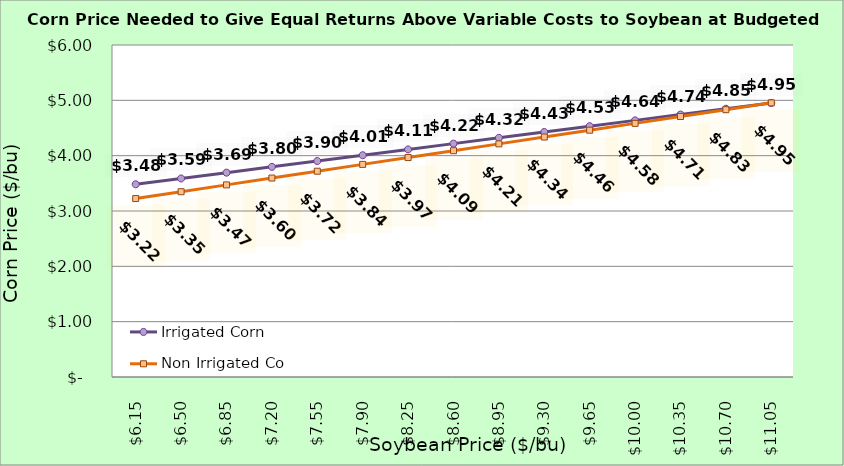
| Category | Irrigated Corn | Non Irrigated Corn |
|---|---|---|
| 6.150000000000002 | 3.483 | 3.225 |
| 6.500000000000002 | 3.588 | 3.348 |
| 6.850000000000001 | 3.693 | 3.472 |
| 7.200000000000001 | 3.798 | 3.596 |
| 7.550000000000001 | 3.903 | 3.719 |
| 7.9 | 4.008 | 3.843 |
| 8.25 | 4.113 | 3.966 |
| 8.6 | 4.218 | 4.09 |
| 8.95 | 4.323 | 4.213 |
| 9.299999999999999 | 4.428 | 4.337 |
| 9.649999999999999 | 4.533 | 4.46 |
| 9.999999999999998 | 4.638 | 4.584 |
| 10.349999999999998 | 4.743 | 4.707 |
| 10.699999999999998 | 4.848 | 4.831 |
| 11.049999999999997 | 4.953 | 4.954 |